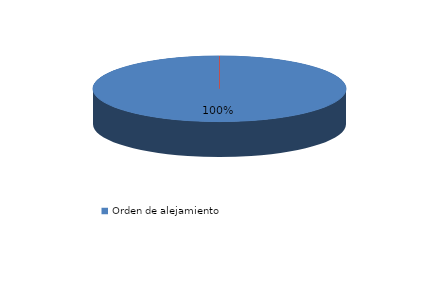
| Category | Series 0 |
|---|---|
| Orden de alejamiento | 342 |
| Orden de protección | 0 |